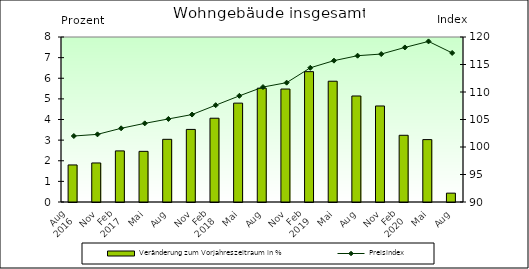
| Category | Veränderung zum Vorjahreszeitraum in % |
|---|---|
| 0 | 1.796 |
| 1 | 1.892 |
| 2 | 2.478 |
| 3 | 2.456 |
| 4 | 3.039 |
| 5 | 3.519 |
| 6 | 4.062 |
| 7 | 4.794 |
| 8 | 5.519 |
| 9 | 5.477 |
| 10 | 6.32 |
| 11 | 5.855 |
| 12 | 5.14 |
| 13 | 4.655 |
| 14 | 3.234 |
| 15 | 3.025 |
| 16 | 0.429 |